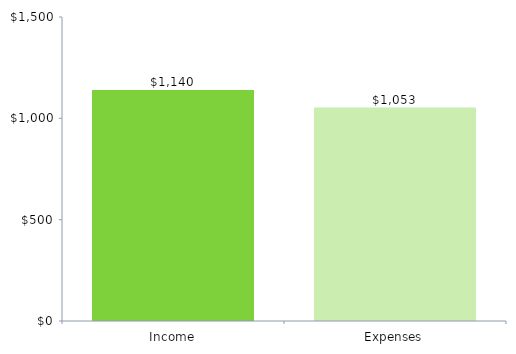
| Category | ChartData |
|---|---|
| 0 | 1140 |
| 1 | 1053 |